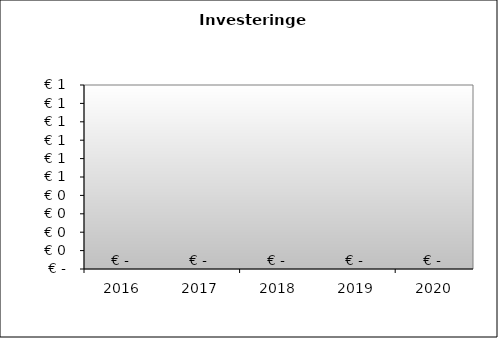
| Category | Series 0 |
|---|---|
| 2016.0 | 0 |
| 2017.0 | 0 |
| 2018.0 | 0 |
| 2019.0 | 0 |
| 2020.0 | 0 |